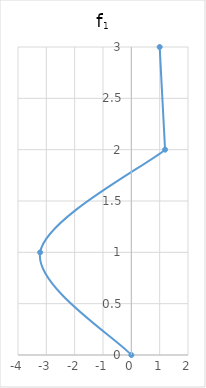
| Category | f1 |
|---|---|
| 0.0 | 0 |
| -3.2189314844123125 | 1 |
| 1.1906069400255248 | 2 |
| 1.0 | 3 |